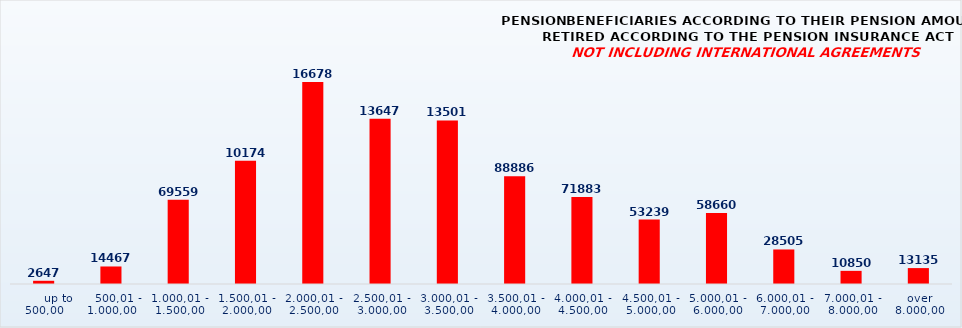
| Category | PENSION BENEFICIARIES ACCORDING TO TYPES AND AMOUNTS OF PENSION, RETIRED ACCORDING TO THE PENSION INSURANCE ACT
NOT INCLUDING INTERNATIONAL AGREEMENTS |
|---|---|
|       up to 500,00 | 2647 |
|    500,01 - 1.000,00 | 14467 |
| 1.000,01 - 1.500,00 | 69559 |
| 1.500,01 - 2.000,00 | 101742 |
| 2.000,01 - 2.500,00 | 166780 |
| 2.500,01 - 3.000,00 | 136474 |
| 3.000,01 - 3.500,00 | 135012 |
| 3.500,01 - 4.000,00 | 88886 |
| 4.000,01 - 4.500,00 | 71883 |
| 4.500,01 - 5.000,00 | 53239 |
| 5.000,01 - 6.000,00 | 58660 |
| 6.000,01 - 7.000,00 | 28505 |
| 7.000,01 - 8.000,00 | 10850 |
|  over  8.000,00 | 13135 |